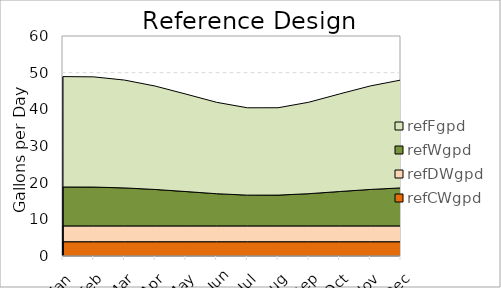
| Category | refCWgpd | refDWgpd | refWgpd | refFgpd |
|---|---|---|---|---|
| Jan | 3.889 | 4.317 | 10.612 | 30.112 |
| Feb | 3.889 | 4.317 | 10.592 | 30.056 |
| Mar | 3.889 | 4.317 | 10.364 | 29.409 |
| Apr | 3.889 | 4.317 | 9.939 | 28.203 |
| May | 3.889 | 4.317 | 9.368 | 26.583 |
| Jun | 3.889 | 4.317 | 8.783 | 24.922 |
| Jul | 3.889 | 4.317 | 8.395 | 23.822 |
| Aug | 3.889 | 4.317 | 8.399 | 23.832 |
| Sep | 3.889 | 4.317 | 8.791 | 24.944 |
| Oct | 3.889 | 4.317 | 9.379 | 26.613 |
| Nov | 3.889 | 4.317 | 9.948 | 28.227 |
| Dec | 3.889 | 4.317 | 10.369 | 29.422 |